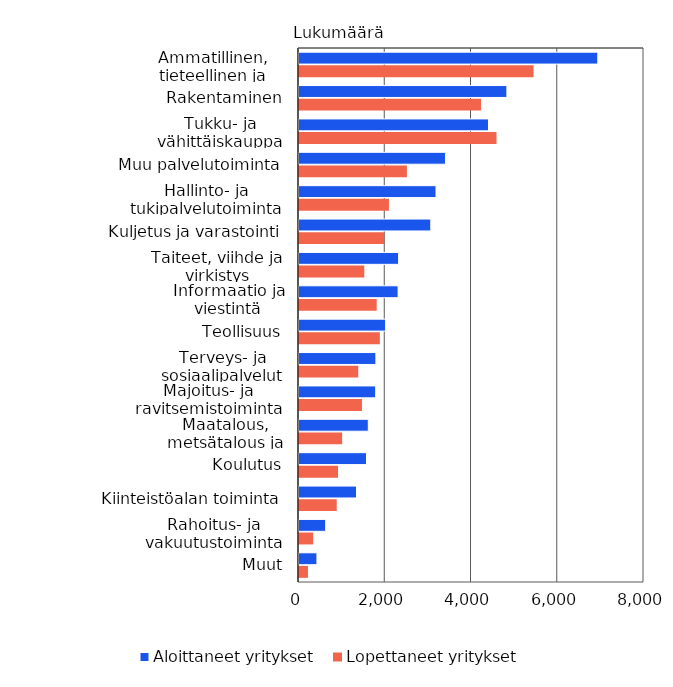
| Category | Aloittaneet yritykset | Lopettaneet yritykset |
|---|---|---|
| Ammatillinen, tieteellinen ja tekninen toiminta | 6929 | 5439 |
| Rakentaminen | 4821 | 4221 |
| Tukku- ja vähittäiskauppa | 4394 | 4580 |
| Muu palvelutoiminta | 3397 | 2502 |
| Hallinto- ja tukipalvelutoiminta | 3177 | 2086 |
| Kuljetus ja varastointi | 3056 | 1977 |
| Taiteet, viihde ja virkistys | 2310 | 1514 |
| Informaatio ja viestintä | 2298 | 1802 |
| Teollisuus | 2009 | 1875 |
| Terveys- ja sosiaalipalvelut | 1783 | 1374 |
| Majoitus- ja ravitsemistoiminta | 1778 | 1460 |
| Maatalous, metsätalous ja kalatalous | 1607 | 1001 |
| Koulutus | 1565 | 906 |
| Kiinteistöalan toiminta | 1334 | 875 |
| Rahoitus- ja vakuutustoiminta | 619 | 329 |
| Muut | 416 | 208 |